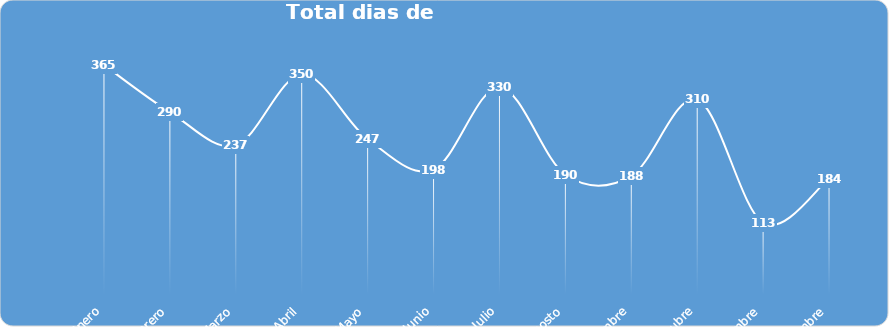
| Category | Total |
|---|---|
| Enero | 365 |
| Febrero | 290 |
| Marzo | 237 |
| Abril | 350 |
| Mayo | 247 |
| Junio | 198 |
| Julio | 330 |
| Agosto | 190 |
| Septiembre | 188 |
| Octubre | 310 |
| Noviembre | 113 |
| Diciembre | 184 |